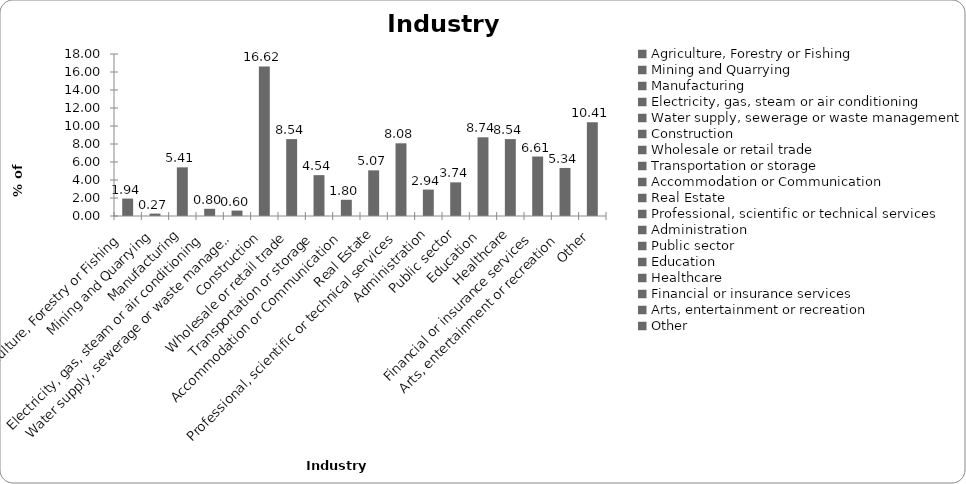
| Category | Series 0 |
|---|---|
| Agriculture, Forestry or Fishing | 1.936 |
| Mining and Quarrying | 0.267 |
| Manufacturing | 5.407 |
| Electricity, gas, steam or air conditioning | 0.801 |
| Water supply, sewerage or waste management | 0.601 |
| Construction | 16.622 |
| Wholesale or retail trade | 8.545 |
| Transportation or storage | 4.539 |
| Accommodation or Communication | 1.802 |
| Real Estate | 5.073 |
| Professional, scientific or technical services | 8.077 |
| Administration | 2.937 |
| Public sector | 3.738 |
| Education | 8.745 |
| Healthcare | 8.545 |
| Financial or insurance services | 6.609 |
| Arts, entertainment or recreation | 5.34 |
| Other | 10.414 |